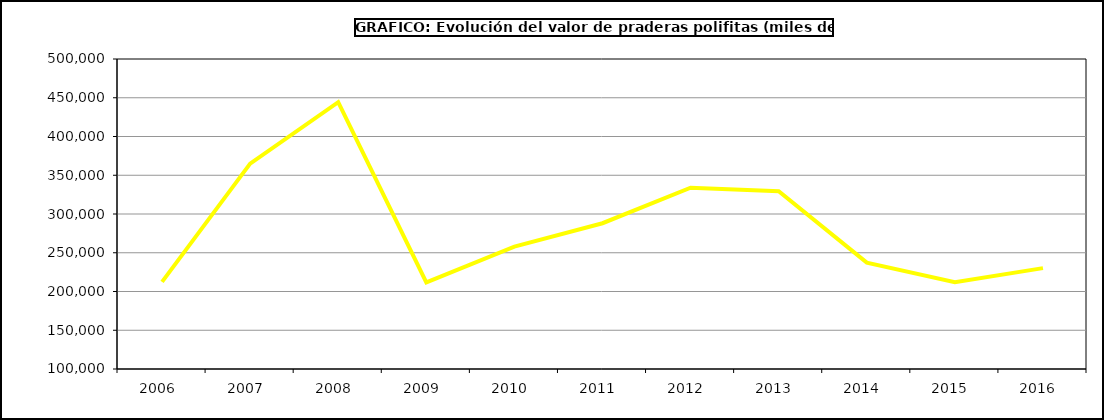
| Category | Valor |
|---|---|
| 2006.0 | 212371.598 |
| 2007.0 | 364940.217 |
| 2008.0 | 444361.431 |
| 2009.0 | 211697.199 |
| 2010.0 | 257899.036 |
| 2011.0 | 288090.963 |
| 2012.0 | 333939.944 |
| 2013.0 | 329402.741 |
| 2014.0 | 237285.995 |
| 2015.0 | 212093 |
| 2016.0 | 230171 |